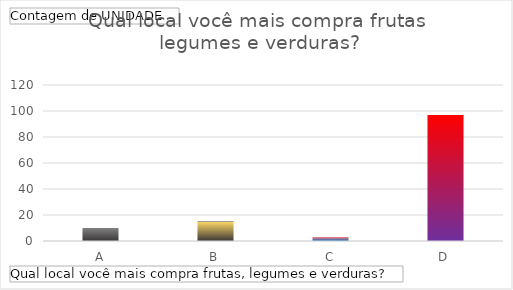
| Category | Total |
|---|---|
| A | 10 |
| B | 15 |
| C | 3 |
| D | 97 |